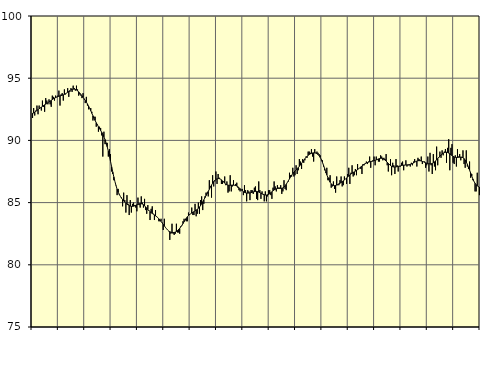
| Category | Piggar | Series 1 |
|---|---|---|
| nan | 91.8 | 92.18 |
| 87.0 | 92.6 | 92.21 |
| 87.0 | 92 | 92.27 |
| 87.0 | 92.4 | 92.34 |
| 87.0 | 92.8 | 92.41 |
| 87.0 | 92.1 | 92.47 |
| 87.0 | 92.8 | 92.54 |
| 87.0 | 92.6 | 92.61 |
| 87.0 | 92.4 | 92.67 |
| 87.0 | 93.2 | 92.74 |
| 87.0 | 92.7 | 92.8 |
| 87.0 | 92.3 | 92.86 |
| nan | 93.4 | 92.91 |
| 88.0 | 93.2 | 92.97 |
| 88.0 | 92.9 | 93.03 |
| 88.0 | 93.3 | 93.09 |
| 88.0 | 92.9 | 93.15 |
| 88.0 | 92.7 | 93.22 |
| 88.0 | 93.6 | 93.28 |
| 88.0 | 93.5 | 93.34 |
| 88.0 | 93.2 | 93.4 |
| 88.0 | 93.6 | 93.44 |
| 88.0 | 93.5 | 93.48 |
| 88.0 | 93.6 | 93.52 |
| nan | 94 | 93.55 |
| 89.0 | 92.8 | 93.58 |
| 89.0 | 93.7 | 93.6 |
| 89.0 | 93.8 | 93.63 |
| 89.0 | 93.2 | 93.66 |
| 89.0 | 94.1 | 93.7 |
| 89.0 | 93.7 | 93.75 |
| 89.0 | 93.8 | 93.81 |
| 89.0 | 94.2 | 93.87 |
| 89.0 | 93.5 | 93.94 |
| 89.0 | 93.9 | 94 |
| 89.0 | 94.2 | 94.06 |
| nan | 93.9 | 94.1 |
| 90.0 | 94.4 | 94.12 |
| 90.0 | 94.2 | 94.12 |
| 90.0 | 94 | 94.1 |
| 90.0 | 94.4 | 94.05 |
| 90.0 | 94.1 | 93.99 |
| 90.0 | 93.6 | 93.9 |
| 90.0 | 93.7 | 93.8 |
| 90.0 | 93.6 | 93.69 |
| 90.0 | 93.4 | 93.58 |
| 90.0 | 93.8 | 93.46 |
| 90.0 | 93.3 | 93.34 |
| nan | 93 | 93.21 |
| 91.0 | 93.5 | 93.08 |
| 91.0 | 92.8 | 92.93 |
| 91.0 | 92.5 | 92.76 |
| 91.0 | 92.6 | 92.58 |
| 91.0 | 92.6 | 92.39 |
| 91.0 | 92.3 | 92.18 |
| 91.0 | 91.6 | 91.98 |
| 91.0 | 91.9 | 91.78 |
| 91.0 | 91.9 | 91.6 |
| 91.0 | 91.1 | 91.42 |
| 91.0 | 91.3 | 91.26 |
| nan | 90.7 | 91.1 |
| 92.0 | 91.1 | 90.95 |
| 92.0 | 91 | 90.8 |
| 92.0 | 90.4 | 90.65 |
| 92.0 | 88.7 | 90.49 |
| 92.0 | 90.7 | 90.29 |
| 92.0 | 89.7 | 90.07 |
| 92.0 | 89.7 | 89.8 |
| 92.0 | 89.8 | 89.49 |
| 92.0 | 88.7 | 89.13 |
| 92.0 | 89.3 | 88.73 |
| 92.0 | 88.9 | 88.32 |
| nan | 87.5 | 87.89 |
| 93.0 | 87.3 | 87.47 |
| 93.0 | 86.8 | 87.07 |
| 93.0 | 86.7 | 86.7 |
| 93.0 | 86.4 | 86.37 |
| 93.0 | 85.6 | 86.08 |
| 93.0 | 86.1 | 85.84 |
| 93.0 | 85.7 | 85.65 |
| 93.0 | 85.5 | 85.5 |
| 93.0 | 85.4 | 85.36 |
| 93.0 | 84.7 | 85.24 |
| 93.0 | 85.8 | 85.13 |
| nan | 85.2 | 85.03 |
| 94.0 | 84.2 | 84.95 |
| 94.0 | 85.6 | 84.87 |
| 94.0 | 84.9 | 84.81 |
| 94.0 | 84 | 84.76 |
| 94.0 | 85.2 | 84.72 |
| 94.0 | 84.2 | 84.7 |
| 94.0 | 84.9 | 84.7 |
| 94.0 | 85 | 84.71 |
| 94.0 | 84.8 | 84.74 |
| 94.0 | 84.6 | 84.78 |
| 94.0 | 84.3 | 84.82 |
| nan | 85.4 | 84.87 |
| 95.0 | 84.8 | 84.9 |
| 95.0 | 84.6 | 84.92 |
| 95.0 | 85.5 | 84.91 |
| 95.0 | 85 | 84.88 |
| 95.0 | 84.6 | 84.83 |
| 95.0 | 85.3 | 84.75 |
| 95.0 | 84.4 | 84.65 |
| 95.0 | 84.1 | 84.55 |
| 95.0 | 84.8 | 84.44 |
| 95.0 | 84.4 | 84.35 |
| 95.0 | 83.6 | 84.26 |
| nan | 84.5 | 84.19 |
| 96.0 | 84.7 | 84.13 |
| 96.0 | 84.1 | 84.07 |
| 96.0 | 83.6 | 84.01 |
| 96.0 | 84.4 | 83.94 |
| 96.0 | 83.9 | 83.87 |
| 96.0 | 83.8 | 83.79 |
| 96.0 | 83.5 | 83.7 |
| 96.0 | 83.5 | 83.6 |
| 96.0 | 83.7 | 83.49 |
| 96.0 | 83.4 | 83.37 |
| 96.0 | 82.8 | 83.25 |
| nan | 83.7 | 83.13 |
| 97.0 | 83 | 83.01 |
| 97.0 | 82.9 | 82.9 |
| 97.0 | 82.8 | 82.8 |
| 97.0 | 82.7 | 82.72 |
| 97.0 | 82 | 82.66 |
| 97.0 | 82.5 | 82.62 |
| 97.0 | 83.3 | 82.59 |
| 97.0 | 82.5 | 82.59 |
| 97.0 | 82.4 | 82.6 |
| 97.0 | 82.5 | 82.63 |
| 97.0 | 83.3 | 82.68 |
| nan | 82.6 | 82.75 |
| 98.0 | 82.6 | 82.84 |
| 98.0 | 82.5 | 82.93 |
| 98.0 | 83.1 | 83.05 |
| 98.0 | 83.2 | 83.17 |
| 98.0 | 83.5 | 83.31 |
| 98.0 | 83.7 | 83.46 |
| 98.0 | 83.6 | 83.6 |
| 98.0 | 83.5 | 83.74 |
| 98.0 | 83.5 | 83.86 |
| 98.0 | 84.2 | 83.96 |
| 98.0 | 84 | 84.04 |
| nan | 84.1 | 84.1 |
| 99.0 | 84.6 | 84.16 |
| 99.0 | 84 | 84.22 |
| 99.0 | 84 | 84.27 |
| 99.0 | 84.9 | 84.33 |
| 99.0 | 83.9 | 84.39 |
| 99.0 | 84.1 | 84.46 |
| 99.0 | 85 | 84.54 |
| 99.0 | 84.1 | 84.64 |
| 99.0 | 85.2 | 84.76 |
| 99.0 | 85.5 | 84.91 |
| 99.0 | 84.4 | 85.06 |
| nan | 84.9 | 85.22 |
| 0.0 | 85.5 | 85.39 |
| 0.0 | 85.8 | 85.56 |
| 0.0 | 85.8 | 85.73 |
| 0.0 | 85.5 | 85.9 |
| 0.0 | 86.8 | 86.07 |
| 0.0 | 86.3 | 86.24 |
| 0.0 | 85.4 | 86.41 |
| 0.0 | 87.2 | 86.56 |
| 0.0 | 86.3 | 86.69 |
| 0.0 | 86.7 | 86.79 |
| 0.0 | 87.5 | 86.86 |
| nan | 86.5 | 86.91 |
| 1.0 | 87.3 | 86.93 |
| 1.0 | 87 | 86.93 |
| 1.0 | 86.9 | 86.89 |
| 1.0 | 86.5 | 86.83 |
| 1.0 | 86.5 | 86.75 |
| 1.0 | 86.7 | 86.65 |
| 1.0 | 87.1 | 86.56 |
| 1.0 | 86.4 | 86.49 |
| 1.0 | 86.7 | 86.43 |
| 1.0 | 85.8 | 86.4 |
| 1.0 | 85.9 | 86.39 |
| nan | 87.2 | 86.39 |
| 2.0 | 85.9 | 86.4 |
| 2.0 | 86.3 | 86.41 |
| 2.0 | 86.8 | 86.4 |
| 2.0 | 86.4 | 86.39 |
| 2.0 | 86.5 | 86.37 |
| 2.0 | 86.6 | 86.33 |
| 2.0 | 86.2 | 86.27 |
| 2.0 | 86 | 86.2 |
| 2.0 | 85.9 | 86.11 |
| 2.0 | 86 | 86.03 |
| 2.0 | 86.1 | 85.95 |
| nan | 85.6 | 85.88 |
| 3.0 | 86.4 | 85.82 |
| 3.0 | 86 | 85.79 |
| 3.0 | 85.1 | 85.77 |
| 3.0 | 86 | 85.76 |
| 3.0 | 85.9 | 85.77 |
| 3.0 | 85.2 | 85.78 |
| 3.0 | 86 | 85.8 |
| 3.0 | 86 | 85.83 |
| 3.0 | 85.7 | 85.86 |
| 3.0 | 86.2 | 85.88 |
| 3.0 | 86.3 | 85.9 |
| nan | 85.3 | 85.9 |
| 4.0 | 85.2 | 85.88 |
| 4.0 | 86.7 | 85.85 |
| 4.0 | 86 | 85.8 |
| 4.0 | 85.3 | 85.76 |
| 4.0 | 85.9 | 85.71 |
| 4.0 | 85.7 | 85.66 |
| 4.0 | 85.1 | 85.63 |
| 4.0 | 85.9 | 85.61 |
| 4.0 | 85.1 | 85.61 |
| 4.0 | 85.5 | 85.63 |
| 4.0 | 86 | 85.66 |
| nan | 86 | 85.72 |
| 5.0 | 85.6 | 85.79 |
| 5.0 | 85.3 | 85.88 |
| 5.0 | 86.2 | 85.95 |
| 5.0 | 86.7 | 86.02 |
| 5.0 | 86.3 | 86.07 |
| 5.0 | 85.9 | 86.11 |
| 5.0 | 86.4 | 86.13 |
| 5.0 | 86.2 | 86.14 |
| 5.0 | 86.2 | 86.14 |
| 5.0 | 86.4 | 86.14 |
| 5.0 | 85.7 | 86.15 |
| nan | 85.9 | 86.18 |
| 6.0 | 86.8 | 86.25 |
| 6.0 | 86.1 | 86.34 |
| 6.0 | 86 | 86.47 |
| 6.0 | 86.6 | 86.61 |
| 6.0 | 86.7 | 86.76 |
| 6.0 | 87.4 | 86.91 |
| 6.0 | 87.2 | 87.06 |
| 6.0 | 87.1 | 87.2 |
| 6.0 | 87.8 | 87.33 |
| 6.0 | 87.1 | 87.44 |
| 6.0 | 87.2 | 87.54 |
| nan | 88 | 87.64 |
| 7.0 | 87.3 | 87.73 |
| 7.0 | 87.6 | 87.82 |
| 7.0 | 88.5 | 87.92 |
| 7.0 | 88.3 | 88.03 |
| 7.0 | 87.7 | 88.15 |
| 7.0 | 88.5 | 88.28 |
| 7.0 | 88.2 | 88.4 |
| 7.0 | 88.4 | 88.52 |
| 7.0 | 88.7 | 88.63 |
| 7.0 | 88.6 | 88.72 |
| 7.0 | 89.1 | 88.8 |
| nan | 89.1 | 88.87 |
| 8.0 | 89 | 88.92 |
| 8.0 | 89.3 | 88.96 |
| 8.0 | 88.7 | 88.99 |
| 8.0 | 88.3 | 89 |
| 8.0 | 89.3 | 88.99 |
| 8.0 | 89 | 88.98 |
| 8.0 | 89.1 | 88.94 |
| 8.0 | 89 | 88.87 |
| 8.0 | 88.9 | 88.77 |
| 8.0 | 88.8 | 88.63 |
| 8.0 | 88.4 | 88.46 |
| nan | 88.4 | 88.24 |
| 9.0 | 87.9 | 88 |
| 9.0 | 87.6 | 87.74 |
| 9.0 | 87.4 | 87.48 |
| 9.0 | 87.8 | 87.23 |
| 9.0 | 86.8 | 87.01 |
| 9.0 | 87 | 86.81 |
| 9.0 | 87.2 | 86.64 |
| 9.0 | 86.2 | 86.51 |
| 9.0 | 86.3 | 86.42 |
| 9.0 | 86.7 | 86.38 |
| 9.0 | 86.1 | 86.36 |
| nan | 85.8 | 86.38 |
| 10.0 | 87.1 | 86.41 |
| 10.0 | 86.4 | 86.45 |
| 10.0 | 86.4 | 86.51 |
| 10.0 | 86.8 | 86.56 |
| 10.0 | 87.1 | 86.62 |
| 10.0 | 86.3 | 86.68 |
| 10.0 | 86.4 | 86.75 |
| 10.0 | 87.1 | 86.82 |
| 10.0 | 86.9 | 86.9 |
| 10.0 | 86.5 | 86.98 |
| 10.0 | 87.3 | 87.06 |
| nan | 87.8 | 87.14 |
| 11.0 | 86.5 | 87.22 |
| 11.0 | 87.4 | 87.3 |
| 11.0 | 88 | 87.36 |
| 11.0 | 87.1 | 87.42 |
| 11.0 | 87.2 | 87.47 |
| 11.0 | 87.7 | 87.53 |
| 11.0 | 87.2 | 87.59 |
| 11.0 | 88.1 | 87.65 |
| 11.0 | 87.7 | 87.72 |
| 11.0 | 87.8 | 87.79 |
| 11.0 | 87.7 | 87.87 |
| nan | 87.3 | 87.94 |
| 12.0 | 88.1 | 88.01 |
| 12.0 | 88 | 88.08 |
| 12.0 | 88.1 | 88.13 |
| 12.0 | 88.3 | 88.18 |
| 12.0 | 88.1 | 88.22 |
| 12.0 | 88.3 | 88.25 |
| 12.0 | 88.7 | 88.28 |
| 12.0 | 87.8 | 88.3 |
| 12.0 | 88.3 | 88.32 |
| 12.0 | 88.4 | 88.34 |
| 12.0 | 88.7 | 88.37 |
| nan | 88 | 88.39 |
| 13.0 | 88.7 | 88.43 |
| 13.0 | 88.5 | 88.47 |
| 13.0 | 88.3 | 88.51 |
| 13.0 | 88.3 | 88.54 |
| 13.0 | 88.8 | 88.56 |
| 13.0 | 88.7 | 88.56 |
| 13.0 | 88.4 | 88.54 |
| 13.0 | 88.6 | 88.49 |
| 13.0 | 88.5 | 88.42 |
| 13.0 | 88.9 | 88.34 |
| 13.0 | 88 | 88.24 |
| nan | 87.5 | 88.15 |
| 14.0 | 88.1 | 88.06 |
| 14.0 | 88.5 | 87.98 |
| 14.0 | 87.2 | 87.92 |
| 14.0 | 88.2 | 87.88 |
| 14.0 | 88 | 87.86 |
| 14.0 | 87.3 | 87.86 |
| 14.0 | 88.5 | 87.87 |
| 14.0 | 88 | 87.89 |
| 14.0 | 87.5 | 87.91 |
| 14.0 | 87.9 | 87.93 |
| 14.0 | 87.9 | 87.95 |
| nan | 88.2 | 87.98 |
| 15.0 | 88.3 | 88 |
| 15.0 | 87.6 | 88.01 |
| 15.0 | 88 | 88.02 |
| 15.0 | 88.4 | 88.03 |
| 15.0 | 87.9 | 88.03 |
| 15.0 | 88 | 88.04 |
| 15.0 | 88 | 88.05 |
| 15.0 | 87.9 | 88.07 |
| 15.0 | 88.2 | 88.1 |
| 15.0 | 88 | 88.14 |
| 15.0 | 88.3 | 88.19 |
| nan | 88.5 | 88.25 |
| 16.0 | 88.3 | 88.3 |
| 16.0 | 87.9 | 88.34 |
| 16.0 | 88.6 | 88.37 |
| 16.0 | 88.5 | 88.37 |
| 16.0 | 88.4 | 88.37 |
| 16.0 | 88.7 | 88.34 |
| 16.0 | 88.1 | 88.31 |
| 16.0 | 88.3 | 88.28 |
| 16.0 | 88.3 | 88.24 |
| 16.0 | 87.8 | 88.2 |
| 16.0 | 88 | 88.17 |
| nan | 88.7 | 88.14 |
| 17.0 | 87.5 | 88.12 |
| 17.0 | 89 | 88.11 |
| 17.0 | 88 | 88.12 |
| 17.0 | 87.3 | 88.15 |
| 17.0 | 88.9 | 88.2 |
| 17.0 | 87.9 | 88.26 |
| 17.0 | 87.6 | 88.35 |
| 17.0 | 89.5 | 88.44 |
| 17.0 | 88 | 88.54 |
| 17.0 | 88.6 | 88.64 |
| 17.0 | 89.1 | 88.74 |
| nan | 88.6 | 88.83 |
| 18.0 | 89.2 | 88.9 |
| 18.0 | 88.8 | 88.97 |
| 18.0 | 89.1 | 89.02 |
| 18.0 | 89.3 | 89.04 |
| 18.0 | 88.2 | 89.05 |
| 18.0 | 89.4 | 89.03 |
| 18.0 | 90.1 | 88.98 |
| 18.0 | 87.6 | 88.93 |
| 18.0 | 89.4 | 88.85 |
| 18.0 | 89.7 | 88.78 |
| 18.0 | 88.2 | 88.72 |
| nan | 88.1 | 88.67 |
| 19.0 | 88.8 | 88.64 |
| 19.0 | 87.9 | 88.63 |
| 19.0 | 89.3 | 88.63 |
| 19.0 | 88.7 | 88.64 |
| 19.0 | 88.9 | 88.65 |
| 19.0 | 88.4 | 88.66 |
| 19.0 | 88.6 | 88.65 |
| 19.0 | 89.2 | 88.61 |
| 19.0 | 88.1 | 88.54 |
| 19.0 | 87.8 | 88.42 |
| 19.0 | 89.2 | 88.26 |
| nan | 87.9 | 88.07 |
| 20.0 | 87.7 | 87.85 |
| 20.0 | 88.3 | 87.62 |
| 20.0 | 87 | 87.37 |
| 20.0 | 87.3 | 87.13 |
| 20.0 | 86.8 | 86.9 |
| 20.0 | 86.7 | 86.71 |
| 20.0 | 85.9 | 86.55 |
| 20.0 | 85.9 | 86.43 |
| 20.0 | 87.4 | 86.35 |
| 20.0 | 86.3 | 86.29 |
| 20.0 | 85.6 | 86.26 |